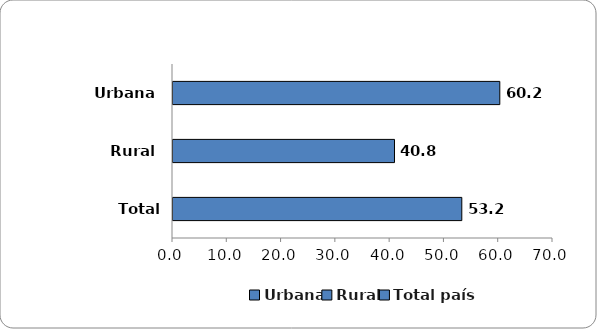
| Category | 2016 |
|---|---|
| Urbana | 60.2 |
| Rural | 40.8 |
| Total país | 53.2 |